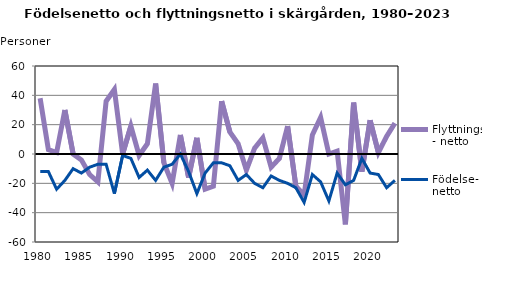
| Category | Flyttnings- netto | Födelse- netto |
|---|---|---|
| 1980.0 | 38 | -12 |
| 1981.0 | 3 | -12 |
| 1982.0 | 1 | -24 |
| 1983.0 | 30 | -18 |
| 1984.0 | 0 | -10 |
| 1985.0 | -4 | -13 |
| 1986.0 | -14 | -9 |
| 1987.0 | -19 | -7 |
| 1988.0 | 36 | -7 |
| 1989.0 | 44 | -27 |
| 1990.0 | 0 | -1 |
| 1991.0 | 19 | -3 |
| 1992.0 | -1 | -16 |
| 1993.0 | 7 | -11 |
| 1994.0 | 48 | -18 |
| 1995.0 | -6 | -9 |
| 1996.0 | -20 | -7 |
| 1997.0 | 13 | 0 |
| 1998.0 | -16 | -12 |
| 1999.0 | 11 | -27 |
| 2000.0 | -24 | -13 |
| 2001.0 | -22 | -6 |
| 2002.0 | 36 | -6 |
| 2003.0 | 15 | -8 |
| 2004.0 | 7 | -18 |
| 2005.0 | -11 | -14 |
| 2006.0 | 4 | -20 |
| 2007.0 | 11 | -23 |
| 2008.0 | -9 | -15 |
| 2009.0 | -3 | -18 |
| 2010.0 | 19 | -20 |
| 2011.0 | -22 | -23 |
| 2012.0 | -28 | -33 |
| 2013.0 | 13 | -14 |
| 2014.0 | 25 | -19 |
| 2015.0 | 0 | -32 |
| 2016.0 | 2 | -13 |
| 2017.0 | -48 | -21 |
| 2018.0 | 35 | -18 |
| 2019.0 | -12 | -3 |
| 2020.0 | 23 | -13 |
| 2021.0 | 1 | -14 |
| 2022.0 | 12 | -23 |
| 2023.0 | 21 | -18 |